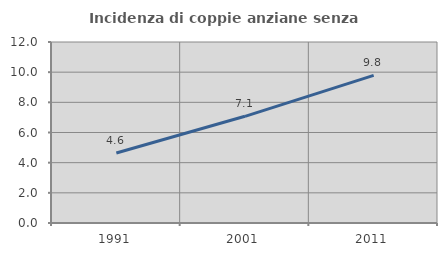
| Category | Incidenza di coppie anziane senza figli  |
|---|---|
| 1991.0 | 4.639 |
| 2001.0 | 7.073 |
| 2011.0 | 9.785 |